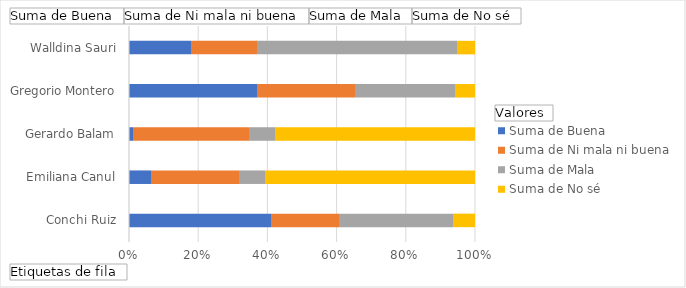
| Category | Suma de Buena | Suma de Ni mala ni buena | Suma de Mala | Suma de No sé |
|---|---|---|---|---|
| Conchi Ruiz | 0.41 | 0.197 | 0.329 | 0.064 |
| Emiliana Canul | 0.064 | 0.254 | 0.075 | 0.607 |
| Gerardo Balam | 0.012 | 0.335 | 0.075 | 0.578 |
| Gregorio Montero | 0.37 | 0.283 | 0.289 | 0.058 |
| Walldina Sauri | 0.179 | 0.191 | 0.578 | 0.052 |